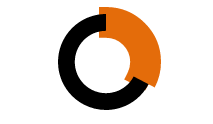
| Category | Series 0 |
|---|---|
| 0 | 0.327 |
| 1 | 0.673 |